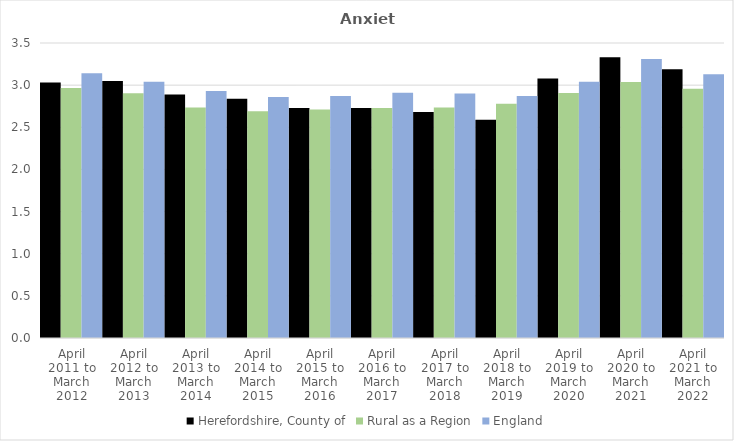
| Category | Herefordshire, County of | Rural as a Region | England |
|---|---|---|---|
| April 2011 to March 2012 | 3.03 | 2.967 | 3.14 |
| April 2012 to March 2013 | 3.05 | 2.904 | 3.04 |
| April 2013 to March 2014 | 2.89 | 2.734 | 2.93 |
| April 2014 to March 2015 | 2.84 | 2.691 | 2.86 |
| April 2015 to March 2016 | 2.73 | 2.711 | 2.87 |
| April 2016 to March 2017 | 2.73 | 2.729 | 2.91 |
| April 2017 to March 2018 | 2.68 | 2.736 | 2.9 |
| April 2018 to March 2019 | 2.59 | 2.78 | 2.87 |
| April 2019 to March 2020 | 3.08 | 2.908 | 3.04 |
| April 2020 to March 2021 | 3.33 | 3.036 | 3.31 |
| April 2021 to March 2022 | 3.19 | 2.956 | 3.13 |